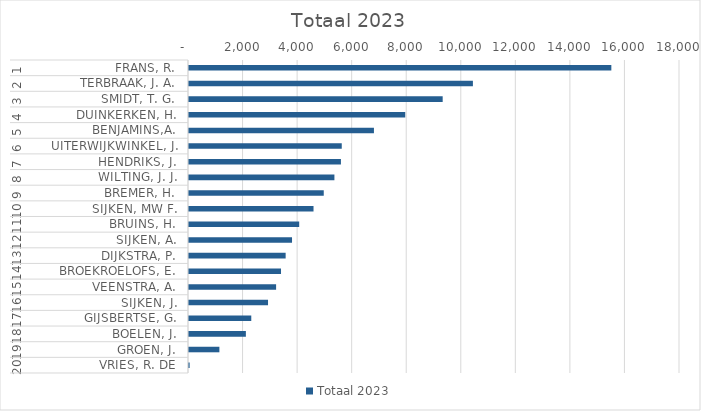
| Category | Totaal 2023 |
|---|---|
| 0 | 15483 |
| 1 | 10408 |
| 2 | 9300 |
| 3 | 7927 |
| 4 | 6780 |
| 5 | 5600 |
| 6 | 5570 |
| 7 | 5331 |
| 8 | 4940 |
| 9 | 4565 |
| 10 | 4040 |
| 11 | 3777 |
| 12 | 3543 |
| 13 | 3373 |
| 14 | 3193 |
| 15 | 2897 |
| 16 | 2283 |
| 17 | 2085 |
| 18 | 1114 |
| 19 | 23 |